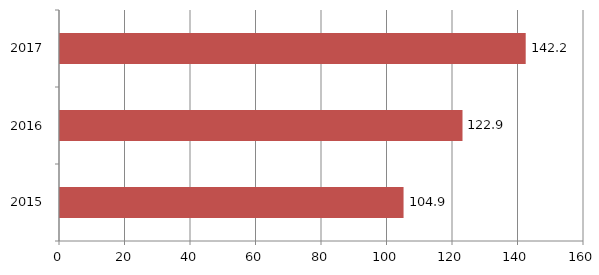
| Category | Series 0 |
|---|---|
| 2015.0 | 104.9 |
| 2016.0 | 122.9 |
| 2017.0 | 142.2 |